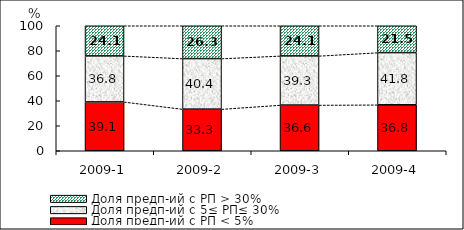
| Category | Доля предп-ий с РП < 5% | Доля предп-ий с 5≤ РП≤ 30% | Доля предп-ий с РП > 30% |
|---|---|---|---|
| 2009-1 | 39.086 | 36.799 | 24.115 |
| 2009-2 | 33.309 | 40.436 | 26.255 |
| 2009-3 | 36.551 | 39.334 | 24.115 |
| 2009-4 | 36.765 | 41.765 | 21.471 |